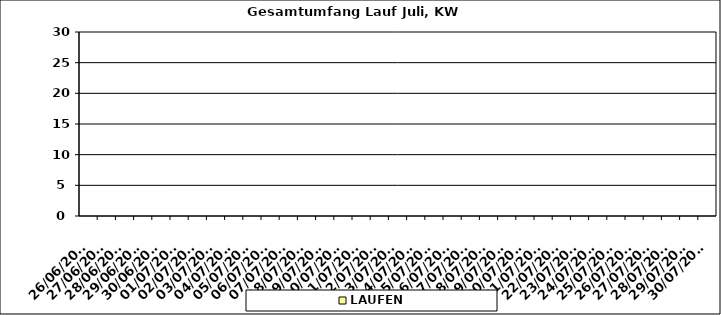
| Category | LAUFEN |
|---|---|
| 26/06/2023 | 0 |
| 27/06/2023 | 0 |
| 28/06/2023 | 0 |
| 29/06/2023 | 0 |
| 30/06/2023 | 0 |
| 01/07/2023 | 0 |
| 02/07/2023 | 0 |
| 03/07/2023 | 0 |
| 04/07/2023 | 0 |
| 05/07/2023 | 0 |
| 06/07/2023 | 0 |
| 07/07/2023 | 0 |
| 08/07/2023 | 0 |
| 09/07/2023 | 0 |
| 10/07/2023 | 0 |
| 11/07/2023 | 0 |
| 12/07/2023 | 0 |
| 13/07/2023 | 0 |
| 14/07/2023 | 0 |
| 15/07/2023 | 0 |
| 16/07/2023 | 0 |
| 17/07/2023 | 0 |
| 18/07/2023 | 0 |
| 19/07/2023 | 0 |
| 20/07/2023 | 0 |
| 21/07/2023 | 0 |
| 22/07/2023 | 0 |
| 23/07/2023 | 0 |
| 24/07/2023 | 0 |
| 25/07/2023 | 0 |
| 26/07/2023 | 0 |
| 27/07/2023 | 0 |
| 28/07/2023 | 0 |
| 29/07/2023 | 0 |
| 30/07/2023 | 0 |